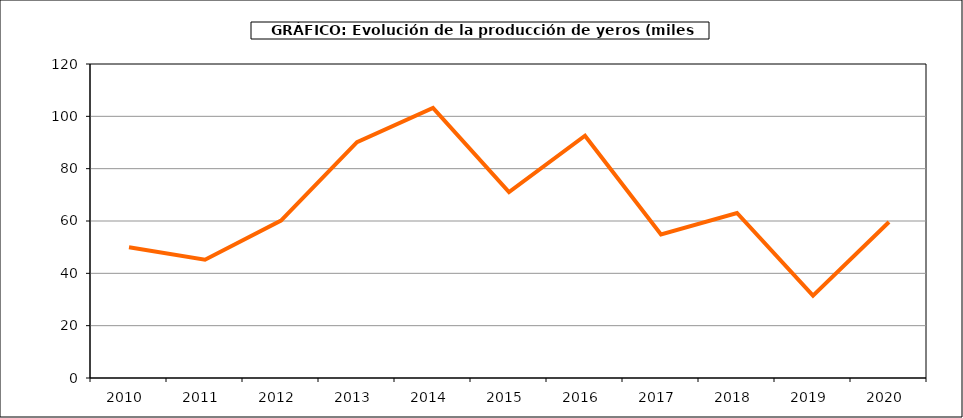
| Category | Producción |
|---|---|
| 2010.0 | 49.937 |
| 2011.0 | 45.202 |
| 2012.0 | 60.147 |
| 2013.0 | 90.163 |
| 2014.0 | 103.242 |
| 2015.0 | 71.021 |
| 2016.0 | 92.587 |
| 2017.0 | 54.869 |
| 2018.0 | 63.055 |
| 2019.0 | 31.495 |
| 2020.0 | 59.609 |